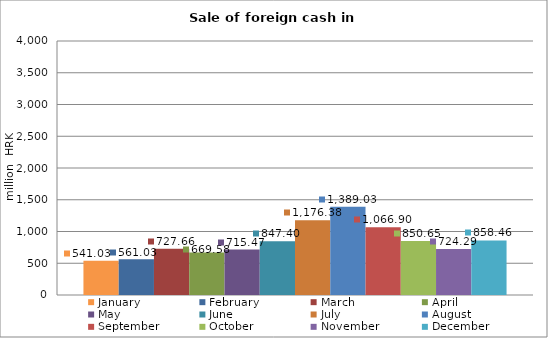
| Category | January | February | March | April | May | June | July | August | September | October | November | December |
|---|---|---|---|---|---|---|---|---|---|---|---|---|
| 0 | 541.03 | 561.029 | 727.659 | 669.578 | 715.469 | 847.399 | 1176.379 | 1389.033 | 1066.902 | 850.649 | 724.287 | 858.464 |